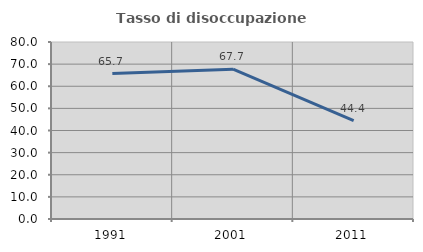
| Category | Tasso di disoccupazione giovanile  |
|---|---|
| 1991.0 | 65.741 |
| 2001.0 | 67.692 |
| 2011.0 | 44.444 |